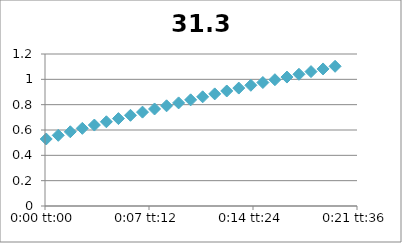
| Category | 31.3 |
|---|---|
| 5.78703703703704e-05 | 0.529 |
| 0.000636574074074074 | 0.558 |
| 0.00121527777777778 | 0.586 |
| 0.00179398148148148 | 0.613 |
| 0.00237268518518518 | 0.639 |
| 0.00295138888888889 | 0.665 |
| 0.00353009259259259 | 0.69 |
| 0.0041087962962963 | 0.716 |
| 0.0046875 | 0.741 |
| 0.0052662037037037 | 0.766 |
| 0.00584490740740741 | 0.791 |
| 0.00642361111111111 | 0.814 |
| 0.00700231481481481 | 0.838 |
| 0.00758101851851852 | 0.862 |
| 0.00815972222222222 | 0.885 |
| 0.00873842592592592 | 0.908 |
| 0.00931712962962963 | 0.931 |
| 0.00989583333333333 | 0.953 |
| 0.010474537037037 | 0.975 |
| 0.0110532407407407 | 0.997 |
| 0.0116319444444444 | 1.018 |
| 0.0122106481481481 | 1.04 |
| 0.0127893518518518 | 1.061 |
| 0.0133680555555556 | 1.082 |
| 0.0139467592592593 | 1.103 |